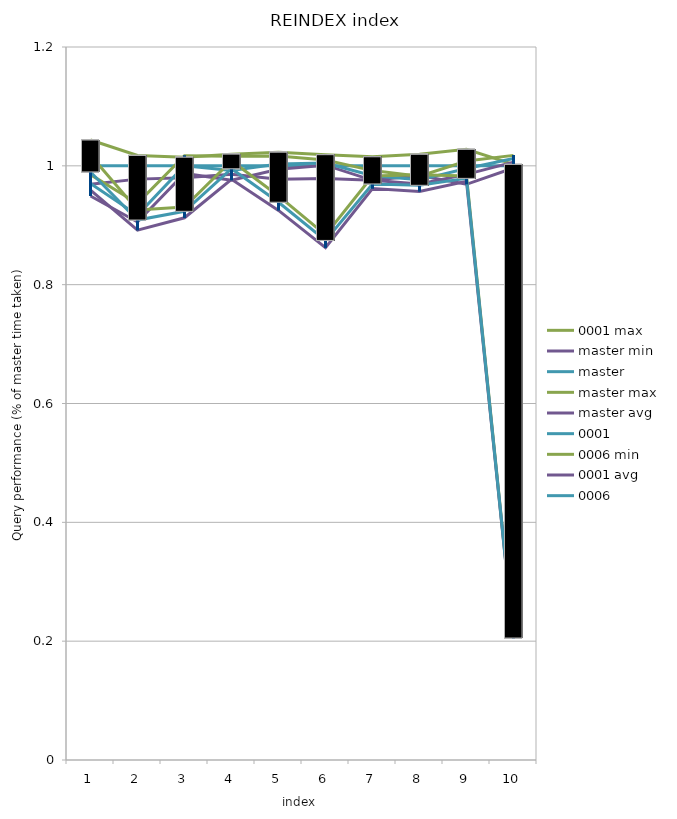
| Category | max | master min | master | avg | 0001 | 0006 min | 0006 |
|---|---|---|---|---|---|---|---|
| 0 | 0.985 | 0.969 | 1 | 0.959 | 0.97 | 1.018 | 0.99 |
| 1 | 0.937 | 0.978 | 1 | 0.892 | 0.917 | 0.926 | 0.909 |
| 2 | 1.017 | 0.98 | 1 | 0.913 | 1 | 0.931 | 0.923 |
| 3 | 1.016 | 0.986 | 1 | 0.977 | 0.992 | 1.008 | 0.995 |
| 4 | 1.017 | 0.978 | 1 | 0.925 | 1.003 | 0.949 | 0.939 |
| 5 | 1.01 | 0.979 | 1 | 0.862 | 1.005 | 0.884 | 0.874 |
| 6 | 0.992 | 0.976 | 1 | 0.962 | 0.983 | 0.983 | 0.97 |
| 7 | 0.983 | 0.984 | 1 | 0.957 | 0.976 | 0.985 | 0.967 |
| 8 | 1.008 | 0.969 | 1 | 0.974 | 0.996 | 0.983 | 0.979 |
| 9 | 1.018 | 0.996 | 1 | 0.205 | 1.012 | 0.206 | 0.205 |